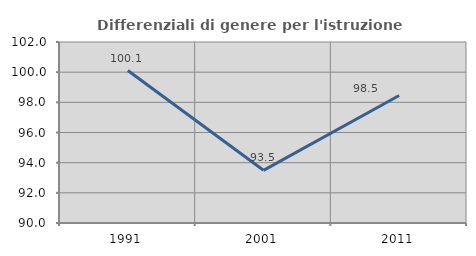
| Category | Differenziali di genere per l'istruzione superiore |
|---|---|
| 1991.0 | 100.105 |
| 2001.0 | 93.493 |
| 2011.0 | 98.456 |